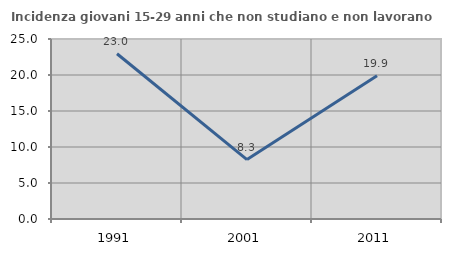
| Category | Incidenza giovani 15-29 anni che non studiano e non lavorano  |
|---|---|
| 1991.0 | 22.951 |
| 2001.0 | 8.257 |
| 2011.0 | 19.892 |